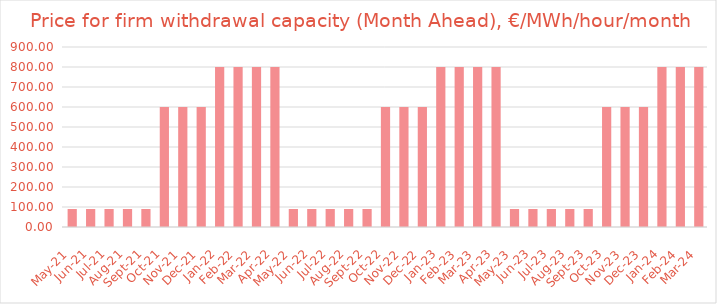
| Category | MA price, €/MWh/hour/month |
|---|---|
| 2021-05-01 | 90 |
| 2021-06-01 | 90 |
| 2021-07-01 | 90 |
| 2021-08-01 | 90 |
| 2021-09-01 | 90 |
| 2021-10-01 | 600 |
| 2021-11-01 | 600 |
| 2021-12-01 | 600 |
| 2022-01-01 | 800 |
| 2022-02-01 | 800 |
| 2022-03-01 | 800 |
| 2022-04-01 | 800 |
| 2022-05-01 | 90 |
| 2022-06-01 | 90 |
| 2022-07-01 | 90 |
| 2022-08-01 | 90 |
| 2022-09-01 | 90 |
| 2022-10-01 | 600 |
| 2022-11-01 | 600 |
| 2022-12-01 | 600 |
| 2023-01-01 | 800 |
| 2023-02-01 | 800 |
| 2023-03-01 | 800 |
| 2023-04-01 | 800 |
| 2023-05-01 | 90 |
| 2023-06-01 | 90 |
| 2023-07-01 | 90 |
| 2023-08-01 | 90 |
| 2023-09-01 | 90 |
| 2023-10-01 | 600 |
| 2023-11-01 | 600 |
| 2023-12-01 | 600 |
| 2024-01-01 | 800 |
| 2024-02-01 | 800 |
| 2024-03-01 | 800 |